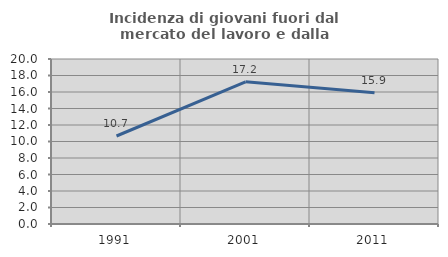
| Category | Incidenza di giovani fuori dal mercato del lavoro e dalla formazione  |
|---|---|
| 1991.0 | 10.667 |
| 2001.0 | 17.241 |
| 2011.0 | 15.909 |